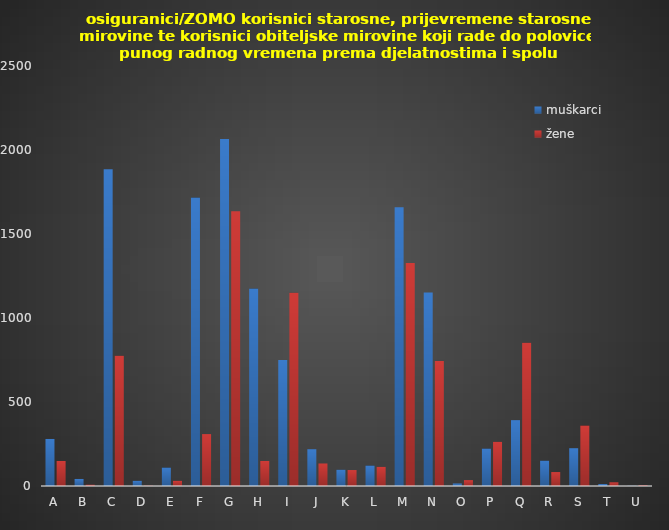
| Category | muškarci | žene |
|---|---|---|
| A | 280 | 149 |
| B | 42 | 8 |
| C | 1886 | 776 |
| D | 31 | 2 |
| E | 110 | 31 |
| F | 1717 | 309 |
| G | 2066 | 1635 |
| H | 1175 | 149 |
| I | 750 | 1151 |
| J | 219 | 134 |
| K | 97 | 95 |
| L | 122 | 114 |
| M | 1659 | 1328 |
| N | 1152 | 744 |
| O | 15 | 35 |
| P | 223 | 263 |
| Q | 392 | 853 |
| R | 151 | 83 |
| S | 225 | 360 |
| T | 12 | 22 |
| U | 1 | 4 |